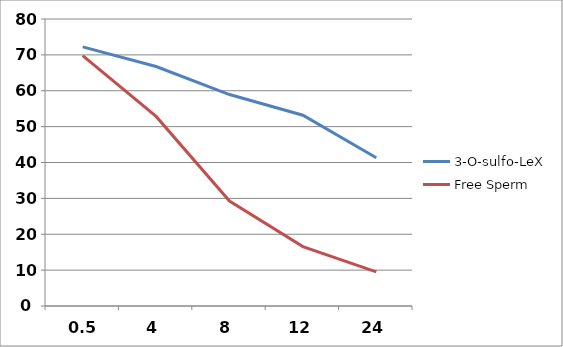
| Category | 3-O-sulfo-LeX | Free Sperm |
|---|---|---|
| 0.5 | 72.22 | 69.78 |
| 4.0 | 66.75 | 52.84 |
| 8.0 | 58.94 | 29.25 |
| 12.0 | 53.177 | 16.57 |
| 24.0 | 41.33 | 9.51 |